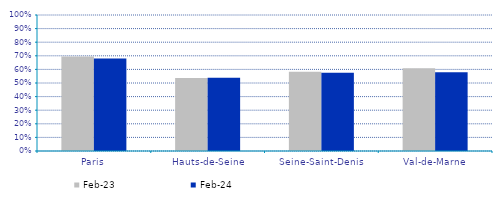
| Category | févr-23 | févr-24 |
|---|---|---|
| Paris | 0.696 | 0.68 |
| Hauts-de-Seine | 0.536 | 0.539 |
| Seine-Saint-Denis | 0.582 | 0.575 |
| Val-de-Marne | 0.609 | 0.579 |